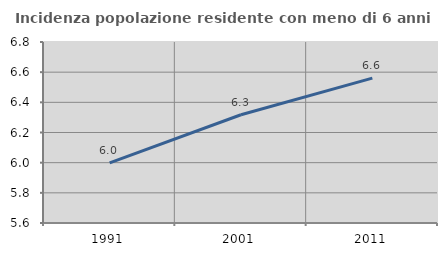
| Category | Incidenza popolazione residente con meno di 6 anni |
|---|---|
| 1991.0 | 5.998 |
| 2001.0 | 6.318 |
| 2011.0 | 6.561 |